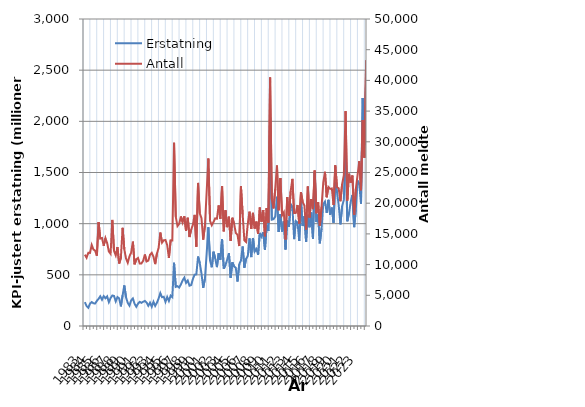
| Category | Erstatning |
|---|---|
| 1983.0 | 232.937 |
| nan | 195.121 |
| nan | 178.438 |
| nan | 218.579 |
| 1984.0 | 234.389 |
| nan | 221.715 |
| nan | 219.826 |
| nan | 245.877 |
| 1985.0 | 265.702 |
| nan | 290.42 |
| nan | 257.346 |
| nan | 291.865 |
| 1986.0 | 270.604 |
| nan | 289.558 |
| nan | 233.055 |
| nan | 272.728 |
| 1987.0 | 297.95 |
| nan | 294.021 |
| nan | 240.61 |
| nan | 283.085 |
| 1988.0 | 269.44 |
| nan | 192.069 |
| nan | 299.153 |
| nan | 396.293 |
| 1989.0 | 279.972 |
| nan | 226.285 |
| nan | 199.112 |
| nan | 251.201 |
| 1990.0 | 268.971 |
| nan | 216.388 |
| nan | 187.666 |
| nan | 218.436 |
| 1991.0 | 235.713 |
| nan | 226.637 |
| nan | 237.191 |
| nan | 245.226 |
| 1992.0 | 229.086 |
| nan | 197.393 |
| nan | 228.083 |
| nan | 188.213 |
| 1993.0 | 236.156 |
| nan | 196.535 |
| nan | 227.061 |
| nan | 268.62 |
| 1994.0 | 321.731 |
| nan | 281.266 |
| nan | 285.763 |
| nan | 235.54 |
| 1995.0 | 283.776 |
| nan | 244.132 |
| nan | 296.645 |
| nan | 281.65 |
| 1996.0 | 617.657 |
| nan | 382.464 |
| nan | 389.296 |
| nan | 375.446 |
| 1997.0 | 406.453 |
| nan | 446.013 |
| nan | 472.333 |
| nan | 421.43 |
| 1998.0 | 444.599 |
| nan | 393.872 |
| nan | 400.307 |
| nan | 460.108 |
| 1999.0 | 501.845 |
| nan | 504.283 |
| nan | 678.577 |
| nan | 614.541 |
| 2000.0 | 512.261 |
| nan | 372.014 |
| nan | 461.192 |
| nan | 703.176 |
| 2001.0 | 965.028 |
| nan | 638.852 |
| nan | 573.774 |
| nan | 725.942 |
| 2002.0 | 661.156 |
| nan | 575.27 |
| nan | 710.935 |
| nan | 647.82 |
| 2003.0 | 847.26 |
| nan | 560.178 |
| nan | 595.958 |
| nan | 649.208 |
| 2004.0 | 712.217 |
| nan | 470.87 |
| nan | 622.509 |
| nan | 581.854 |
| 2005.0 | 569.493 |
| nan | 434.602 |
| nan | 603.345 |
| nan | 639.394 |
| 2006.0 | 777.195 |
| nan | 569.965 |
| nan | 655.815 |
| nan | 684.196 |
| 2007.0 | 856.408 |
| nan | 673.317 |
| nan | 860.276 |
| nan | 727.347 |
| 2008.0 | 752.172 |
| nan | 696.322 |
| nan | 909.437 |
| nan | 873.42 |
| 2009.0 | 916.557 |
| nan | 744.098 |
| nan | 982.934 |
| nan | 929.078 |
| 2010.0 | 2038.021 |
| nan | 1039.492 |
| nan | 1044.493 |
| nan | 1068.56 |
| 2011.0 | 1262.842 |
| nan | 918.31 |
| nan | 1094.943 |
| nan | 922.779 |
| 2012.0 | 1022.313 |
| nan | 747.404 |
| nan | 1030.461 |
| nan | 970.277 |
| 2013.0 | 1191.601 |
| nan | 1166.802 |
| nan | 849.019 |
| nan | 1025.516 |
| 2014.0 | 1011.435 |
| nan | 830.588 |
| nan | 1221.838 |
| nan | 976.933 |
| 2015.0 | 1071.822 |
| nan | 820.828 |
| nan | 1086.542 |
| nan | 964.725 |
| 2016.0 | 1109.027 |
| nan | 853.659 |
| nan | 1497.167 |
| nan | 1015.828 |
| 2017.0 | 1088.954 |
| nan | 807.65 |
| nan | 953.843 |
| nan | 1191.034 |
| 2018.0 | 1215.874 |
| nan | 1106.121 |
| nan | 1232.942 |
| nan | 1087.816 |
| 2019.0 | 1157.146 |
| nan | 1008.947 |
| nan | 1404.229 |
| nan | 1307.73 |
| 2020.0 | 1182.332 |
| nan | 993.156 |
| nan | 1171.889 |
| nan | 1232.253 |
| 2021.0 | 1816.342 |
| nan | 1023.29 |
| nan | 1100.926 |
| nan | 1213.6 |
| 2022.0 | 1280.476 |
| nan | 966.126 |
| nan | 1138.392 |
| nan | 1421.118 |
| 2023.0 | 1384.154 |
| nan | 1195.57 |
| nan | 2227.739 |
| nan | 1767.169 |
| nan | 2404.675 |